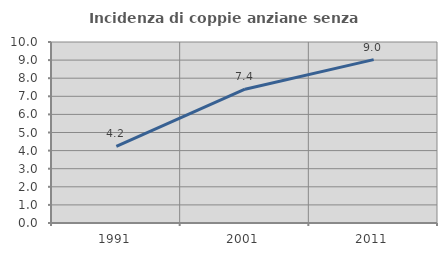
| Category | Incidenza di coppie anziane senza figli  |
|---|---|
| 1991.0 | 4.237 |
| 2001.0 | 7.392 |
| 2011.0 | 9.025 |